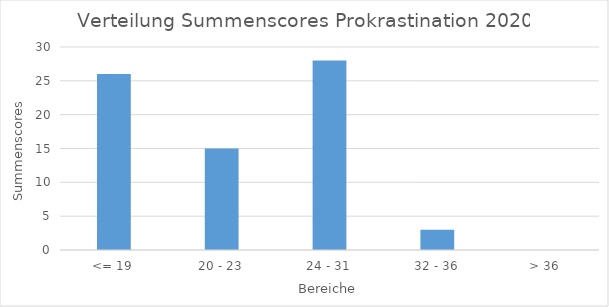
| Category | Anzahl |
|---|---|
| <= 19 | 26 |
| 20 - 23 | 15 |
| 24 - 31 | 28 |
| 32 - 36 | 3 |
| > 36 | 0 |